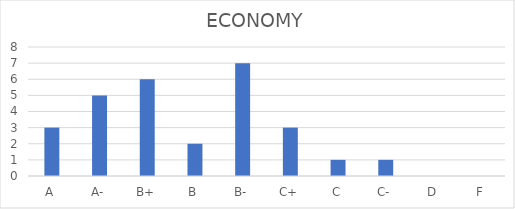
| Category | ECONOMY |
|---|---|
| A | 3 |
| A- | 5 |
| B+ | 6 |
| B | 2 |
| B- | 7 |
| C+ | 3 |
| C | 1 |
| C- | 1 |
| D | 0 |
| F | 0 |